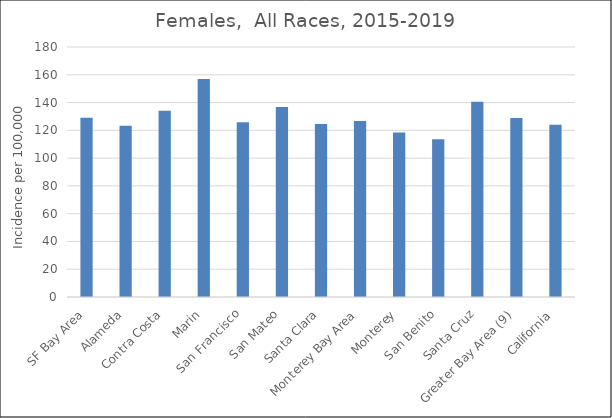
| Category | Rate |
|---|---|
| SF Bay Area | 129.14 |
|   Alameda | 123.22 |
|   Contra Costa | 134.11 |
|   Marin | 157.04 |
|   San Francisco | 125.8 |
|   San Mateo | 136.89 |
|   Santa Clara | 124.64 |
| Monterey Bay Area | 126.79 |
|   Monterey | 118.4 |
|   San Benito | 113.64 |
|   Santa Cruz | 140.64 |
| Greater Bay Area (9) | 128.93 |
| California | 124.07 |